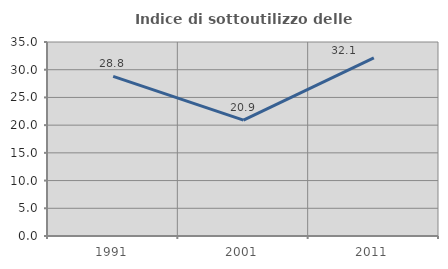
| Category | Indice di sottoutilizzo delle abitazioni  |
|---|---|
| 1991.0 | 28.804 |
| 2001.0 | 20.918 |
| 2011.0 | 32.124 |